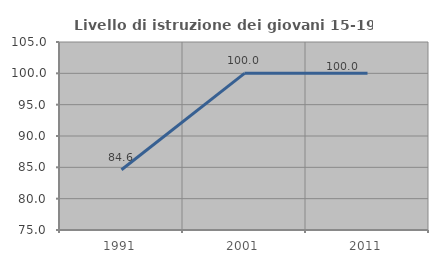
| Category | Livello di istruzione dei giovani 15-19 anni |
|---|---|
| 1991.0 | 84.615 |
| 2001.0 | 100 |
| 2011.0 | 100 |